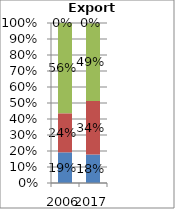
| Category | Other commercial services | Travel | Transport | Goods-related services |
|---|---|---|---|---|
| 2006.0 | 0.192 | 0.244 | 0.564 | 0.001 |
| 2017.0 | 0.178 | 0.335 | 0.486 | 0.001 |